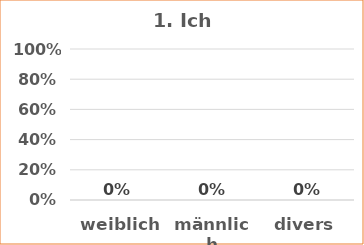
| Category | Series 1 |
|---|---|
| weiblich | 0 |
| männlich | 0 |
| divers | 0 |